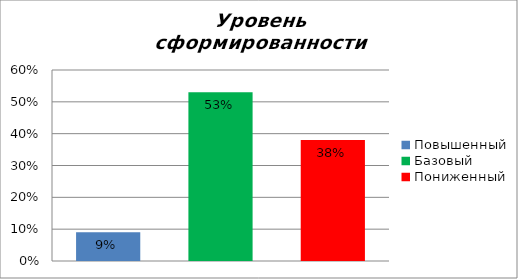
| Category | Уровень сформированности предметных результатов |
|---|---|
| Повышенный | 0.09 |
| Базовый | 0.53 |
| Пониженный | 0.38 |